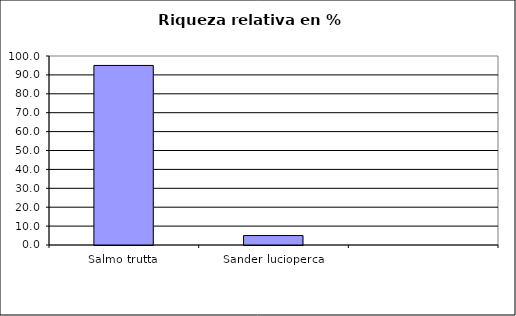
| Category | Series 0 |
|---|---|
| Salmo trutta | 95 |
| Sander lucioperca | 5 |